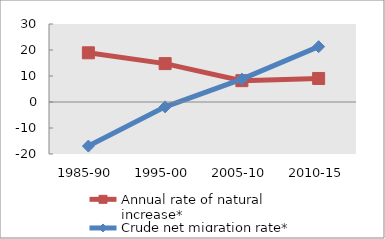
| Category | Annual rate of natural increase* | Crude net migration rate* |
|---|---|---|
| 1985-90 | 18.921 | -16.956 |
| 1995-00 | 14.765 | -1.878 |
| 2005-10 | 8.206 | 8.807 |
| 2010-15 | 9.049 | 21.289 |